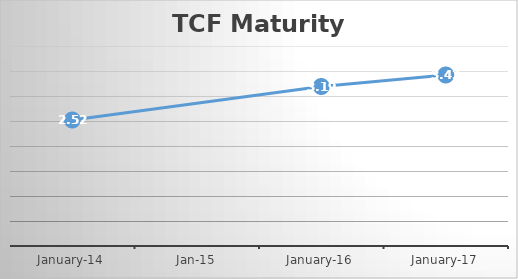
| Category | Series 0 |
|---|---|
| 2014-10-01 | 2.52 |
| 2016-10-01 | 3.19 |
| 2017-10-01 | 3.42 |